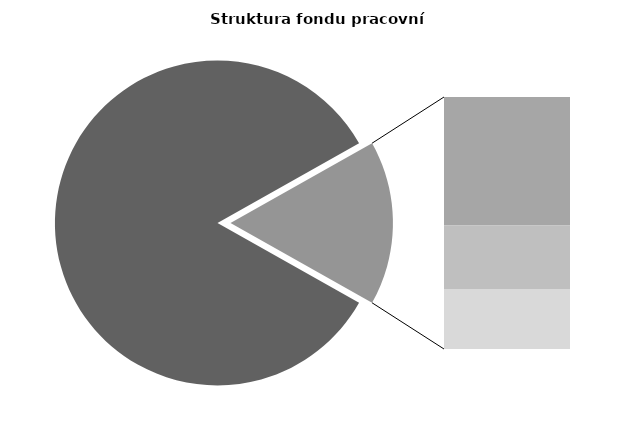
| Category | Series 0 |
|---|---|
| Průměrná měsíční odpracovaná doba bez přesčasu | 141.726 |
| Dovolená | 14.103 |
| Nemoc | 6.985 |
| Jiné | 6.59 |